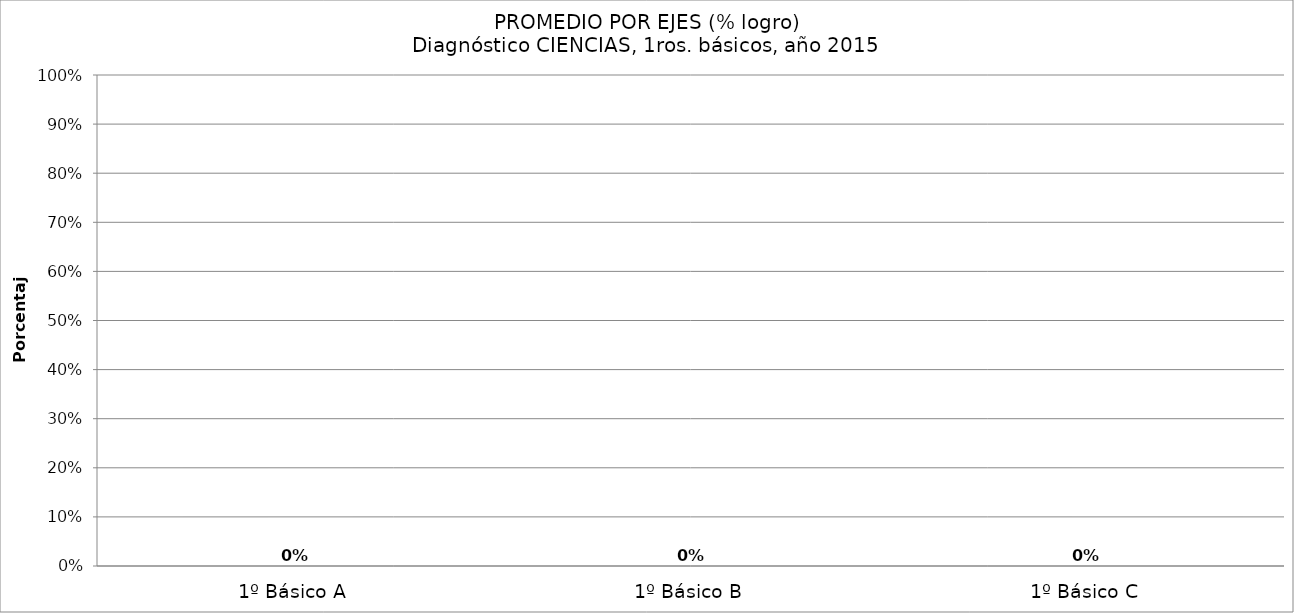
| Category | Series 0 |
|---|---|
| 1º Básico A | 0 |
| 1º Básico B | 0 |
| 1º Básico C | 0 |